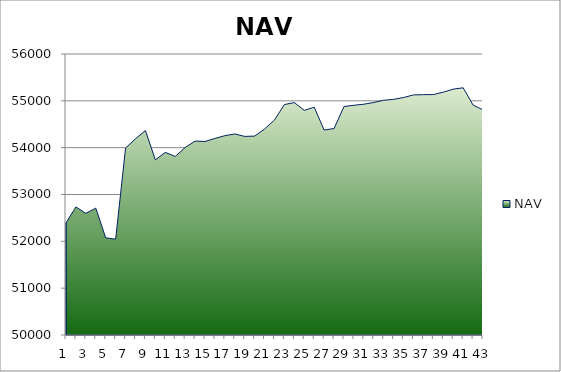
| Category | NAV |
|---|---|
| 0 | 52397 |
| 1 | 52733.957 |
| 2 | 52597.875 |
| 3 | 52708.772 |
| 4 | 52075.184 |
| 5 | 52046.775 |
| 6 | 53991.219 |
| 7 | 54189.909 |
| 8 | 54364.909 |
| 9 | 53739.909 |
| 10 | 53899.542 |
| 11 | 53812.294 |
| 12 | 54003.961 |
| 13 | 54140.037 |
| 14 | 54132.37 |
| 15 | 54197.37 |
| 16 | 54255.812 |
| 17 | 54292.622 |
| 18 | 54240.699 |
| 19 | 54246.834 |
| 20 | 54397.391 |
| 21 | 54592.197 |
| 22 | 54920.119 |
| 23 | 54963.245 |
| 24 | 54796.799 |
| 25 | 54863.963 |
| 26 | 54375.975 |
| 27 | 54409.015 |
| 28 | 54878.402 |
| 29 | 54905.151 |
| 30 | 54927.958 |
| 31 | 54964.157 |
| 32 | 55012.385 |
| 33 | 55031.616 |
| 34 | 55070.791 |
| 35 | 55126.461 |
| 36 | 55131.71 |
| 37 | 55133.391 |
| 38 | 55184.783 |
| 39 | 55249.119 |
| 40 | 55278.196 |
| 41 | 54909.993 |
| 42 | 54807.052 |